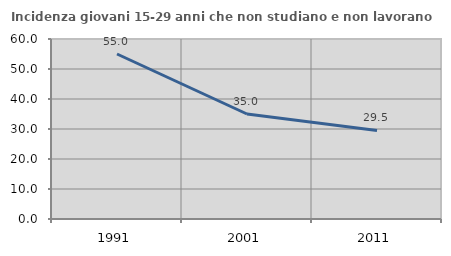
| Category | Incidenza giovani 15-29 anni che non studiano e non lavorano  |
|---|---|
| 1991.0 | 55 |
| 2001.0 | 35 |
| 2011.0 | 29.508 |